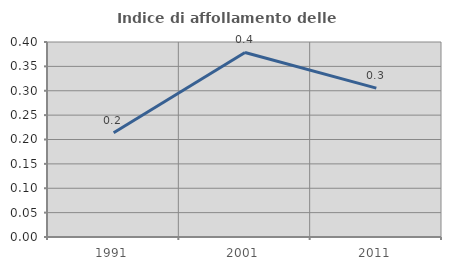
| Category | Indice di affollamento delle abitazioni  |
|---|---|
| 1991.0 | 0.214 |
| 2001.0 | 0.379 |
| 2011.0 | 0.305 |